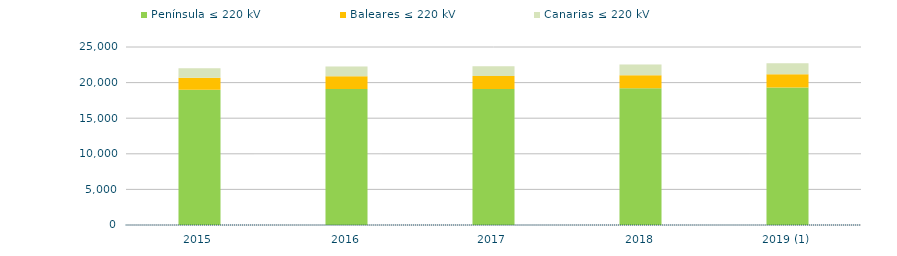
| Category | Península ≤ 220 kV | Baleares ≤ 220 kV | Canarias ≤ 220 kV |
|---|---|---|---|
| 2015 | 19003.568 | 1674.002 | 1346.959 |
| 2016 | 19091.545 | 1800.936 | 1354.165 |
| 2017 | 19116.907 | 1809.219 | 1355.097 |
| 2018 | 19192.41 | 1853.942 | 1481.836 |
| 2019 (1) | 19294.862 | 1872.945 | 1548.768 |